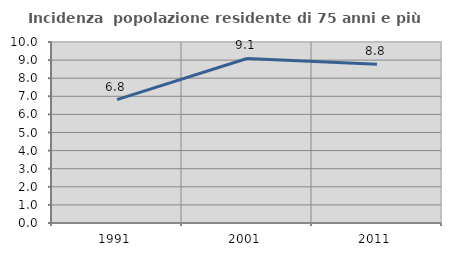
| Category | Incidenza  popolazione residente di 75 anni e più |
|---|---|
| 1991.0 | 6.814 |
| 2001.0 | 9.091 |
| 2011.0 | 8.77 |